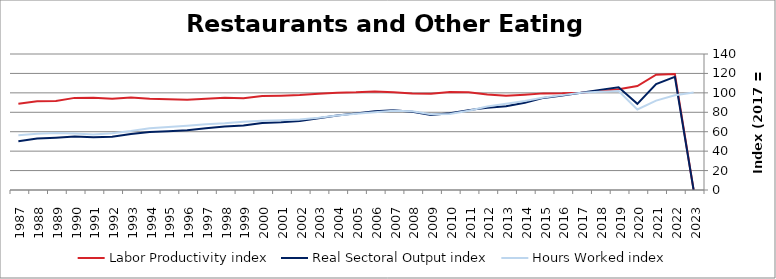
| Category | Labor Productivity index | Real Sectoral Output index | Hours Worked index |
|---|---|---|---|
| 2023.0 | 0 | 0 | 100.448 |
| 2022.0 | 119.412 | 116.396 | 97.474 |
| 2021.0 | 118.651 | 109.122 | 91.969 |
| 2020.0 | 106.955 | 88.702 | 82.934 |
| 2019.0 | 103.724 | 105.701 | 101.906 |
| 2018.0 | 101.949 | 103.078 | 101.108 |
| 2017.0 | 100 | 100 | 100 |
| 2016.0 | 99.482 | 97.156 | 97.663 |
| 2015.0 | 99.465 | 94.806 | 95.317 |
| 2014.0 | 98.088 | 89.78 | 91.53 |
| 2013.0 | 97.108 | 86.269 | 88.838 |
| 2012.0 | 98.396 | 84.554 | 85.932 |
| 2011.0 | 100.705 | 82.226 | 81.65 |
| 2010.0 | 100.941 | 79.018 | 78.282 |
| 2009.0 | 99.091 | 77.298 | 78.007 |
| 2008.0 | 99.278 | 80.486 | 81.071 |
| 2007.0 | 100.542 | 82.035 | 81.593 |
| 2006.0 | 101.423 | 81.197 | 80.058 |
| 2005.0 | 100.501 | 78.872 | 78.478 |
| 2004.0 | 100.119 | 76.697 | 76.605 |
| 2003.0 | 99.167 | 73.785 | 74.405 |
| 2002.0 | 97.889 | 71.146 | 72.681 |
| 2001.0 | 97.104 | 69.792 | 71.874 |
| 2000.0 | 96.741 | 68.976 | 71.3 |
| 1999.0 | 94.515 | 66.355 | 70.206 |
| 1998.0 | 94.996 | 65.277 | 68.716 |
| 1997.0 | 93.96 | 63.575 | 67.662 |
| 1996.0 | 92.823 | 61.472 | 66.225 |
| 1995.0 | 93.505 | 60.529 | 64.733 |
| 1994.0 | 93.968 | 59.686 | 63.518 |
| 1993.0 | 95.214 | 57.721 | 60.622 |
| 1992.0 | 94.033 | 54.837 | 58.317 |
| 1991.0 | 95.011 | 54.333 | 57.186 |
| 1990.0 | 94.829 | 55.037 | 58.038 |
| 1989.0 | 91.729 | 53.82 | 58.673 |
| 1988.0 | 91.396 | 52.953 | 57.937 |
| 1987.0 | 88.876 | 50.135 | 56.41 |